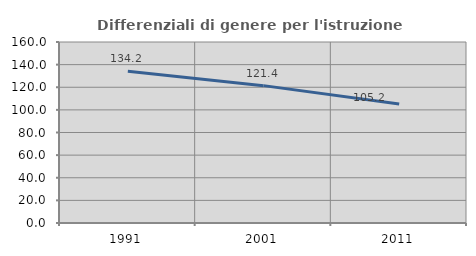
| Category | Differenziali di genere per l'istruzione superiore |
|---|---|
| 1991.0 | 134.169 |
| 2001.0 | 121.429 |
| 2011.0 | 105.178 |